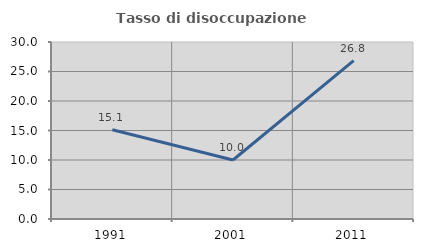
| Category | Tasso di disoccupazione giovanile  |
|---|---|
| 1991.0 | 15.116 |
| 2001.0 | 10 |
| 2011.0 | 26.829 |